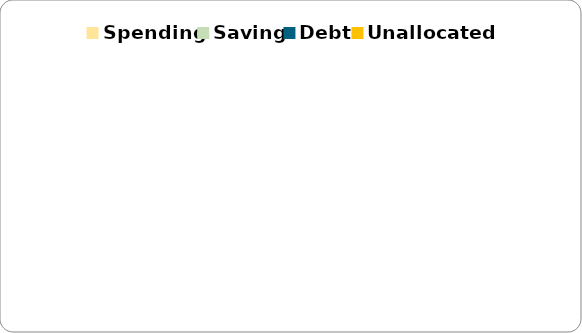
| Category | Monthly |
|---|---|
| Spending | 0 |
| Saving | 0 |
| Debt | 0 |
| Unallocated | 0 |